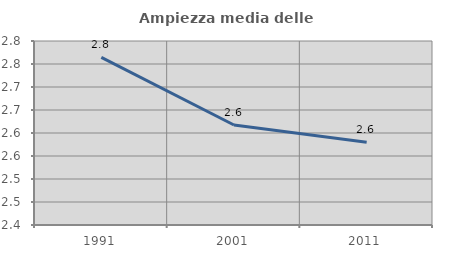
| Category | Ampiezza media delle famiglie |
|---|---|
| 1991.0 | 2.764 |
| 2001.0 | 2.617 |
| 2011.0 | 2.58 |